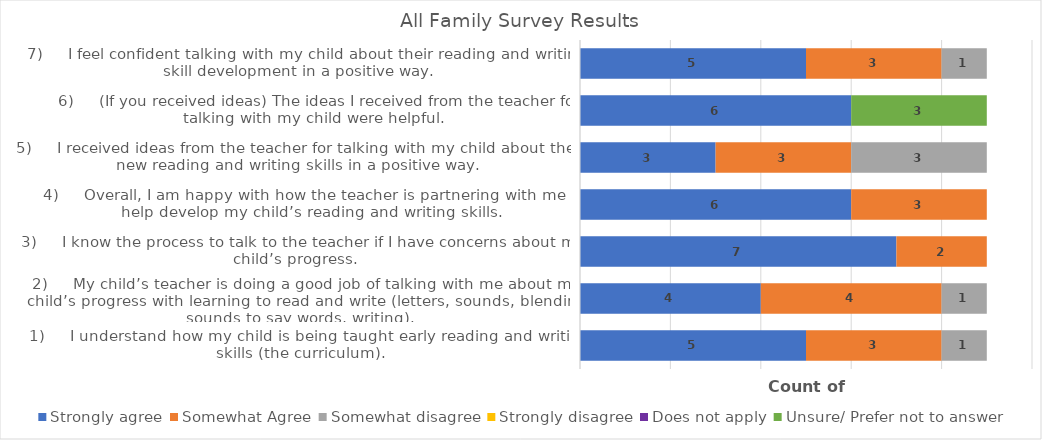
| Category | Strongly agree | Somewhat Agree | Somewhat disagree | Strongly disagree | Does not apply | Unsure/ Prefer not to answer |
|---|---|---|---|---|---|---|
| 1)     I understand how my child is being taught early reading and writing skills (the curriculum). | 5 | 3 | 1 | 0 | 0 | 0 |
| 2)     My child’s teacher is doing a good job of talking with me about my child’s progress with learning to read and write (letters, sounds, blending sounds to say words, writing). | 4 | 4 | 1 | 0 | 0 | 0 |
| 3)     I know the process to talk to the teacher if I have concerns about my child’s progress. | 7 | 2 | 0 | 0 | 0 | 0 |
| 4)     Overall, I am happy with how the teacher is partnering with me to help develop my child’s reading and writing skills. | 6 | 3 | 0 | 0 | 0 | 0 |
| 5)     I received ideas from the teacher for talking with my child about their new reading and writing skills in a positive way. | 3 | 3 | 3 | 0 | 0 | 0 |
| 6)     (If you received ideas) The ideas I received from the teacher for talking with my child were helpful.  | 6 | 0 | 0 | 0 | 0 | 3 |
| 7)     I feel confident talking with my child about their reading and writing skill development in a positive way.  | 5 | 3 | 1 | 0 | 0 | 0 |